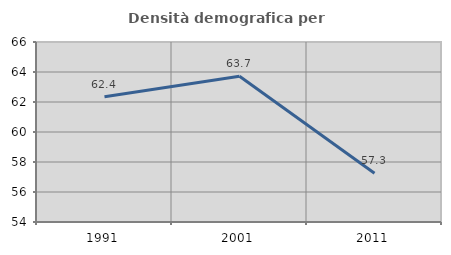
| Category | Densità demografica |
|---|---|
| 1991.0 | 62.354 |
| 2001.0 | 63.714 |
| 2011.0 | 57.252 |